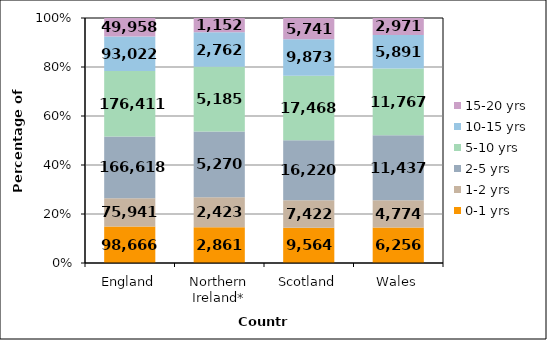
| Category | 0-1 yrs | 1-2 yrs | 2-5 yrs | 5-10 yrs | 10-15 yrs | 15-20 yrs |
|---|---|---|---|---|---|---|
| England | 98666 | 75941 | 166618 | 176411 | 93022 | 49958 |
| Northern Ireland* | 2861 | 2423 | 5270 | 5185 | 2762 | 1152 |
| Scotland | 9564 | 7422 | 16220 | 17468 | 9873 | 5741 |
| Wales | 6256 | 4774 | 11437 | 11767 | 5891 | 2971 |